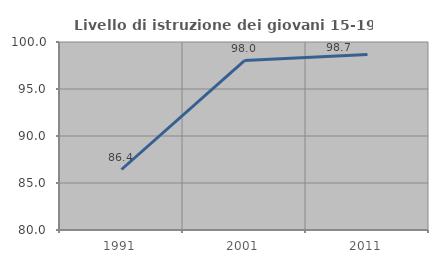
| Category | Livello di istruzione dei giovani 15-19 anni |
|---|---|
| 1991.0 | 86.436 |
| 2001.0 | 98.03 |
| 2011.0 | 98.681 |